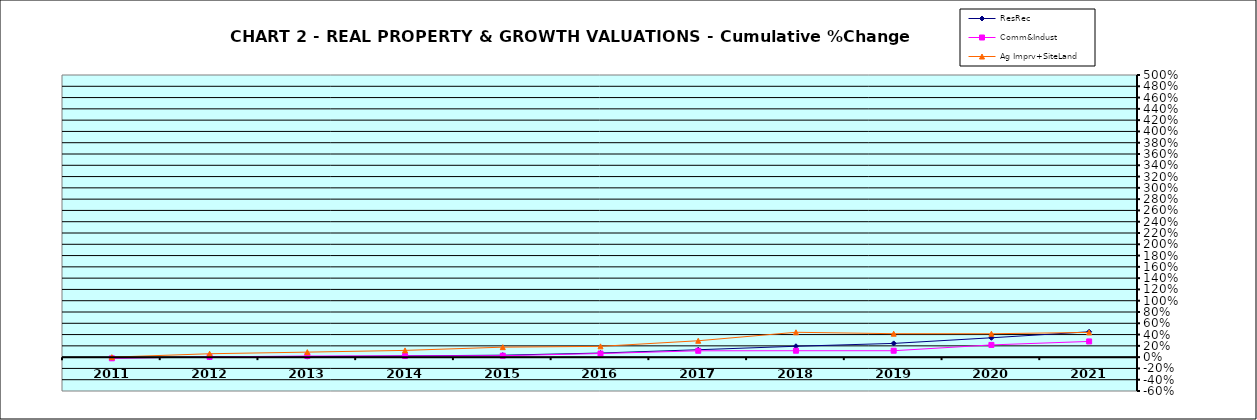
| Category | ResRec | Comm&Indust | Ag Imprv+SiteLand |
|---|---|---|---|
| 2011.0 | -0.013 | -0.021 | 0 |
| 2012.0 | -0.002 | 0.005 | 0.06 |
| 2013.0 | 0.009 | 0.02 | 0.089 |
| 2014.0 | 0.023 | 0.022 | 0.119 |
| 2015.0 | 0.035 | 0.025 | 0.177 |
| 2016.0 | 0.073 | 0.064 | 0.191 |
| 2017.0 | 0.131 | 0.113 | 0.29 |
| 2018.0 | 0.193 | 0.114 | 0.441 |
| 2019.0 | 0.243 | 0.114 | 0.415 |
| 2020.0 | 0.343 | 0.217 | 0.414 |
| 2021.0 | 0.45 | 0.278 | 0.438 |